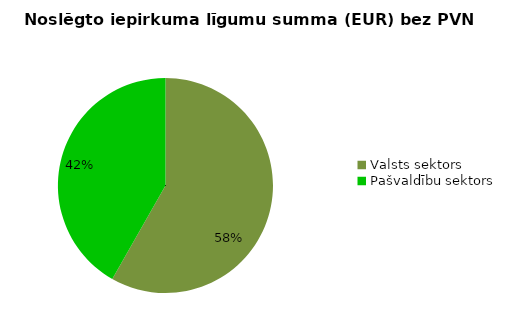
| Category | Noslēgto iepirkuma līgumu summa (EUR) bez PVN |
|---|---|
| Valsts sektors | 19360582 |
| Pašvaldību sektors | 13879516 |